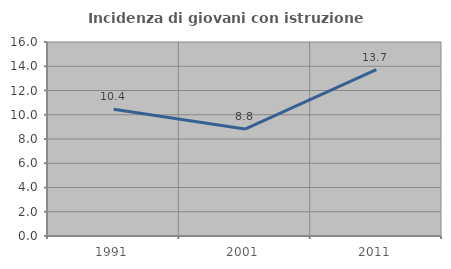
| Category | Incidenza di giovani con istruzione universitaria |
|---|---|
| 1991.0 | 10.448 |
| 2001.0 | 8.824 |
| 2011.0 | 13.725 |